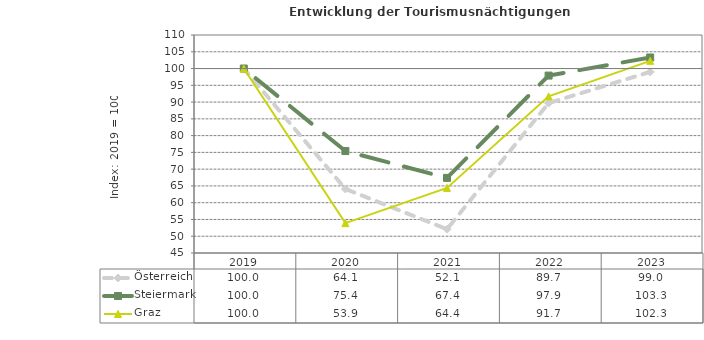
| Category | Österreich | Steiermark | Graz |
|---|---|---|---|
| 2023.0 | 99 | 103.3 | 102.3 |
| 2022.0 | 89.7 | 97.9 | 91.7 |
| 2021.0 | 52.1 | 67.4 | 64.4 |
| 2020.0 | 64.1 | 75.4 | 53.9 |
| 2019.0 | 100 | 100 | 100 |